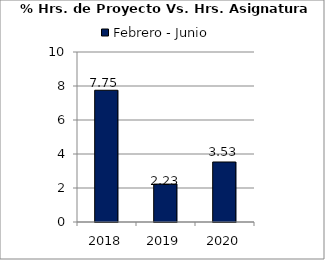
| Category | Febrero - Junio |
|---|---|
| 2018.0 | 7.75 |
| 2019.0 | 2.23 |
| 2020.0 | 3.53 |